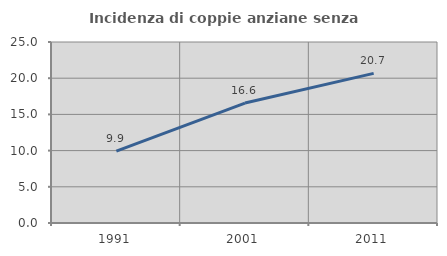
| Category | Incidenza di coppie anziane senza figli  |
|---|---|
| 1991.0 | 9.938 |
| 2001.0 | 16.564 |
| 2011.0 | 20.667 |